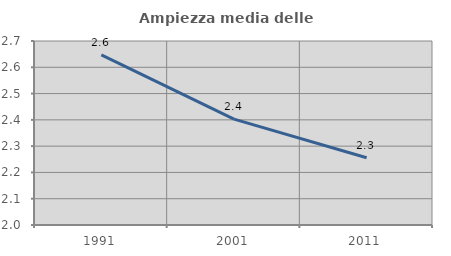
| Category | Ampiezza media delle famiglie |
|---|---|
| 1991.0 | 2.647 |
| 2001.0 | 2.403 |
| 2011.0 | 2.256 |